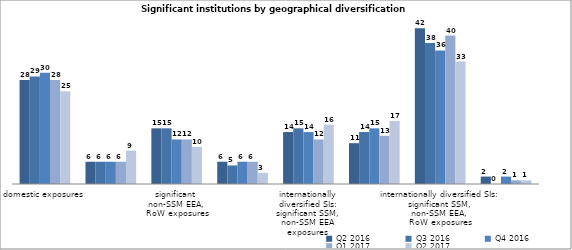
| Category | Q2 2016 | Q3 2016 | Q4 2016 | Q1 2017 | Q2 2017 |
|---|---|---|---|---|---|
| domestic exposures | 28 | 29 | 30 | 28 | 25 |
| significant SSM
(non-domestic) exposures | 6 | 6 | 6 | 6 | 9 |
| significant 
non-SSM EEA, 
RoW exposures | 15 | 15 | 12 | 12 | 10 |
| internationally
diversified SIs:
significant SSM
exposures | 6 | 5 | 6 | 6 | 3 |
| internationally
diversified SIs:
significant SSM,
non-SSM EEA
exposures | 14 | 15 | 14 | 12 | 16 |
| internationally diversified SIs:
significant SSM,
RoW exposures | 11 | 14 | 15 | 13 | 17 |
| internationally diversified SIs:
significant SSM,
non-SSM EEA, 
RoW exposures | 42 | 38 | 36 | 40 | 33 |
| without geographical focus | 2 | 0 | 2 | 1 | 1 |